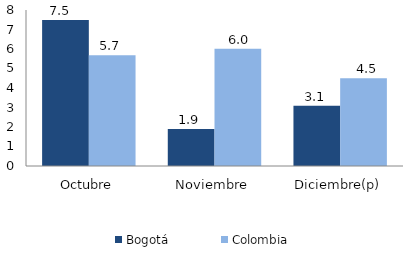
| Category | Bogotá | Colombia |
|---|---|---|
| Octubre | 7.481 | 5.679 |
| Noviembre | 1.898 | 6.012 |
| Diciembre(p) | 3.084 | 4.506 |